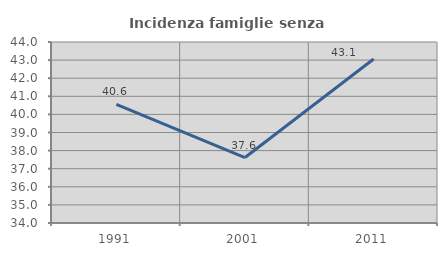
| Category | Incidenza famiglie senza nuclei |
|---|---|
| 1991.0 | 40.559 |
| 2001.0 | 37.616 |
| 2011.0 | 43.058 |